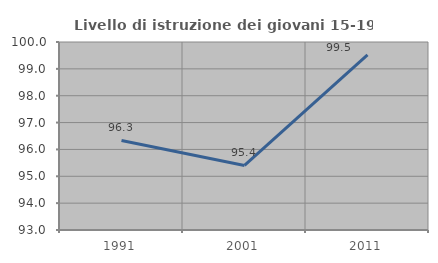
| Category | Livello di istruzione dei giovani 15-19 anni |
|---|---|
| 1991.0 | 96.335 |
| 2001.0 | 95.402 |
| 2011.0 | 99.524 |